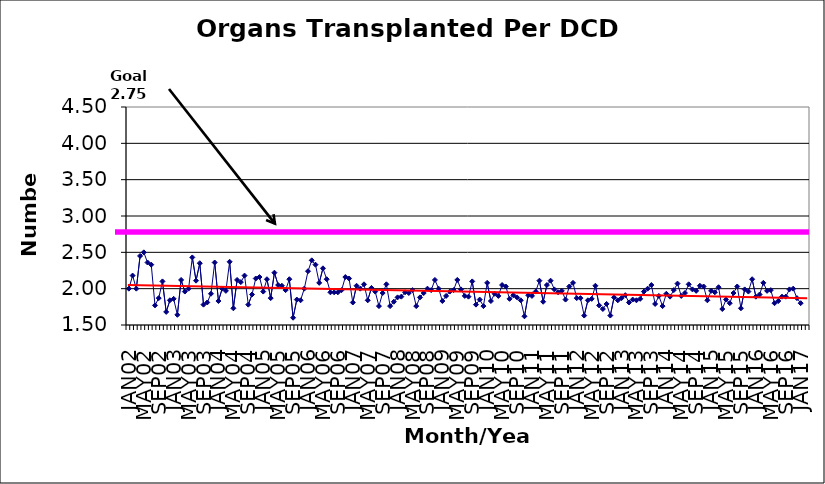
| Category | Series 0 |
|---|---|
| JAN02 | 2 |
| FEB02 | 2.18 |
| MAR02 | 2 |
| APR02 | 2.45 |
| MAY02 | 2.5 |
| JUN02 | 2.36 |
| JUL02 | 2.33 |
| AUG02 | 1.77 |
| SEP02 | 1.87 |
| OCT02 | 2.1 |
| NOV02 | 1.68 |
| DEC02 | 1.84 |
| JAN03 | 1.86 |
| FEB03 | 1.64 |
| MAR03 | 2.12 |
| APR03 | 1.96 |
| MAY03 | 2 |
| JUN03 | 2.43 |
| JUL03 | 2.11 |
| AUG03 | 2.35 |
| SEP03 | 1.78 |
| OCT03 | 1.81 |
| NOV03 | 1.93 |
| DEC03 | 2.36 |
| JAN04 | 1.83 |
| FEB04 | 2 |
| MAR04 | 1.97 |
| APR04 | 2.37 |
| MAY04 | 1.73 |
| JUN04 | 2.12 |
| JUL04 | 2.09 |
| AUG04 | 2.18 |
| SEP04 | 1.78 |
| OCT04 | 1.92 |
| NOV04 | 2.14 |
| DEC04 | 2.16 |
| JAN05 | 1.96 |
| FEB05 | 2.13 |
| MAR05 | 1.87 |
| APR05 | 2.22 |
| MAY05 | 2.05 |
| JUN05 | 2.04 |
| JUL05 | 1.98 |
| AUG05 | 2.13 |
| SEP05 | 1.6 |
| OCT05 | 1.85 |
| NOV05 | 1.84 |
| DEC05 | 2 |
| JAN06 | 2.24 |
| FEB06 | 2.39 |
| MAR06 | 2.33 |
| APR06 | 2.08 |
| MAY06 | 2.28 |
| JUN06 | 2.13 |
| JUL06 | 1.95 |
| AUG06 | 1.95 |
| SEP06 | 1.95 |
| OCT06 | 1.98 |
| NOV06 | 2.16 |
| DEC06 | 2.14 |
| JAN07 | 1.81 |
| FEB07 | 2.04 |
| MAR07 | 2 |
| APR07 | 2.06 |
| MAY07 | 1.84 |
| JUN07 | 2.01 |
| JUL07 | 1.96 |
| AUG07 | 1.76 |
| SEP07 | 1.94 |
| OCT07 | 2.06 |
| NOV07 | 1.76 |
| DEC07 | 1.82 |
| JAN08 | 1.88 |
| FEB08 | 1.89 |
| MAR08 | 1.95 |
| APR08 | 1.94 |
| MAY08 | 1.98 |
| JUN08 | 1.76 |
| JUL08 | 1.88 |
| AUG08 | 1.94 |
| SEP08 | 2 |
| OCT08 | 1.98 |
| NOV08 | 2.12 |
| DEC08 | 2 |
| JAN09 | 1.83 |
| FEB09 | 1.9 |
| MAR09 | 1.96 |
| APR09 | 1.98 |
| MAY09 | 2.12 |
| JUN09 | 1.99 |
| JUL09 | 1.9 |
| AUG09 | 1.89 |
| SEP09 | 2.1 |
| OCT09 | 1.78 |
| NOV09 | 1.85 |
| DEC09 | 1.76 |
| JAN10 | 2.08 |
| FEB10 | 1.83 |
| MAR10 | 1.93 |
| APR10 | 1.9 |
| MAY10 | 2.05 |
| JUN10 | 2.03 |
| JUL10 | 1.86 |
| AUG10 | 1.91 |
| SEP10 | 1.88 |
| OCT10 | 1.84 |
| NOV10 | 1.62 |
| DEC10 | 1.91 |
| JAN11 | 1.9 |
| FEB11 | 1.96 |
| MAR11 | 2.11 |
| APR11 | 1.82 |
| MAY11 | 2.05 |
| JUN11 | 2.11 |
| JUL11 | 1.99 |
| AUG11 | 1.95 |
| SEP11 | 1.97 |
| OCT11 | 1.85 |
| NOV11 | 2.03 |
| DEC11 | 2.08 |
| JAN12 | 1.87 |
| FEB12 | 1.87 |
| MAR12 | 1.63 |
| APR12 | 1.84 |
| MAY12 | 1.86 |
| JUN12 | 2.04 |
| JUL12 | 1.77 |
| AUG12 | 1.72 |
| SEP12 | 1.79 |
| OCT12 | 1.63 |
| NOV12 | 1.88 |
| DEC12 | 1.84 |
| JAN13 | 1.87 |
| FEB13 | 1.91 |
| MAR13 | 1.81 |
| APR13 | 1.85 |
| MAY13 | 1.84 |
| JUN13 | 1.86 |
| JUL13 | 1.96 |
| AUG13 | 2 |
| SEP13 | 2.05 |
| OCT13 | 1.79 |
| NOV13 | 1.9 |
| DEC13 | 1.76 |
| JAN14 | 1.93 |
| FEB14 | 1.89 |
| MAR14 | 1.98 |
| APR14 | 2.07 |
| MAY14 | 1.9 |
| JUN14 | 1.94 |
| JUL14 | 2.06 |
| AUG14 | 1.99 |
| SEP14 | 1.97 |
| OCT14 | 2.04 |
| NOV14 | 2.03 |
| DEC14 | 1.84 |
| JAN15 | 1.97 |
| FEB15 | 1.95 |
| MAR15 | 2.02 |
| APR15 | 1.72 |
| MAY15 | 1.85 |
| JUN15 | 1.8 |
| JUL15 | 1.94 |
| AUG15 | 2.03 |
| SEP15 | 1.73 |
| OCT15 | 1.99 |
| NOV15 | 1.96 |
| DEC15 | 2.13 |
| JAN16 | 1.89 |
| FEB16 | 1.92 |
| MAR16 | 2.08 |
| APR16 | 1.97 |
| MAY16 | 1.98 |
| JUN16 | 1.8 |
| JUL16 | 1.83 |
| AUG16 | 1.89 |
| SEP16 | 1.89 |
| OCT16 | 1.99 |
| NOV16 | 2 |
| DEC16 | 1.87 |
| JAN17 | 1.8 |